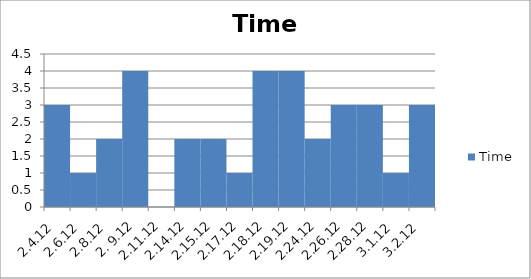
| Category | Time |
|---|---|
| 2.4.12 | 3 |
| 2.6.12 | 1 |
| 2.8.12 | 2 |
| 2. 9.12 | 4 |
| 2.11.12 | 0 |
| 2.14.12 | 2 |
| 2.15.12 | 2 |
| 2.17.12 | 1 |
| 2.18.12 | 4 |
| 2.19.12 | 4 |
| 2.24.12 | 2 |
| 2.26.12 | 3 |
| 2.28.12 | 3 |
| 3.1.12 | 1 |
| 3.2.12 | 3 |